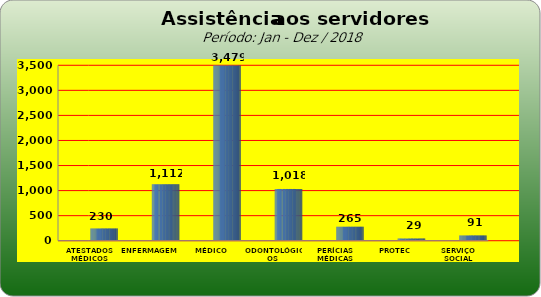
| Category | Series 0 |
|---|---|
| ATESTADOS MÉDICOS | 230 |
| ENFERMAGEM | 1112 |
| MÉDICO | 3479 |
| ODONTOLÓGICOS | 1018 |
| PERÍCIAS MÉDICAS | 265 |
| PROTEC | 29 |
| SERVIÇO SOCIAL | 91 |